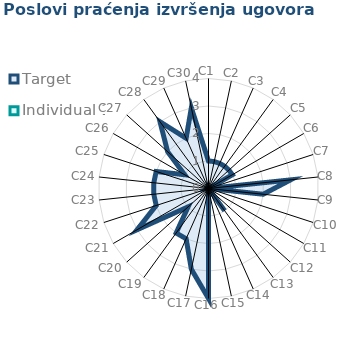
| Category | Target | Individual 1 |
|---|---|---|
| C1 | 1 | 0 |
| C2 | 1 | 0 |
| C3 | 1 | 0 |
| C4 | 1 | 0 |
| C5 | 1 | 0 |
| C6 | 1 | 0 |
| C7 | 0 | 0 |
| C8 | 3 | 0 |
| C9 | 2 | 0 |
| C10 | 0 | 0 |
| C11 | 0 | 0 |
| C12 | 0 | 0 |
| C13 | 1 | 0 |
| C14 | 0 | 0 |
| C15 | 0 | 0 |
| C16 | 4 | 0 |
| C17 | 3 | 0 |
| C18 | 2 | 0 |
| C19 | 2 | 0 |
| C20 | 1 | 0 |
| C21 | 3 | 0 |
| C22 | 2 | 0 |
| C23 | 2 | 0 |
| C24 | 2 | 0 |
| C25 | 2 | 0 |
| C26 | 1 | 0 |
| C27 | 2 | 0 |
| C28 | 3 | 0 |
| C29 | 2 | 0 |
| C30 | 3 | 0 |